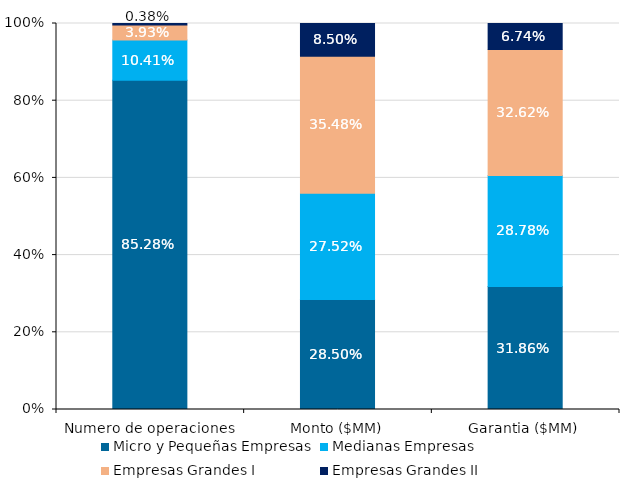
| Category | Micro y Pequeñas Empresas | Medianas Empresas | Empresas Grandes I | Empresas Grandes II |
|---|---|---|---|---|
| Numero de operaciones | 0.853 | 0.104 | 0.039 | 0.004 |
| Monto ($MM) | 0.285 | 0.275 | 0.355 | 0.085 |
| Garantia ($MM) | 0.319 | 0.288 | 0.326 | 0.067 |